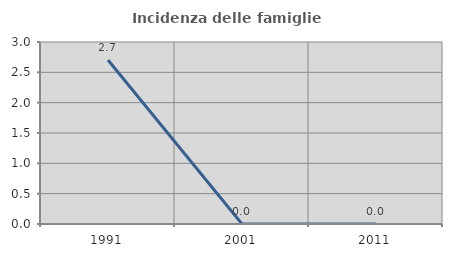
| Category | Incidenza delle famiglie numerose |
|---|---|
| 1991.0 | 2.703 |
| 2001.0 | 0 |
| 2011.0 | 0 |